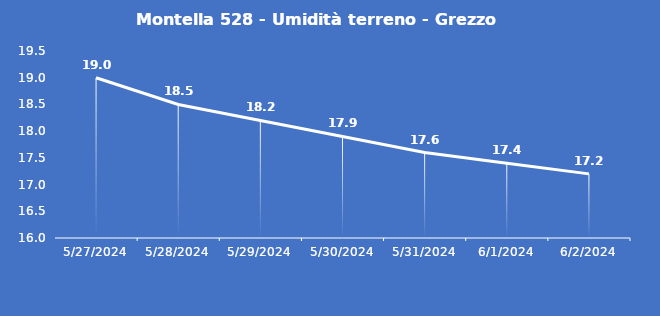
| Category | Montella 528 - Umidità terreno - Grezzo (%VWC) |
|---|---|
| 5/27/24 | 19 |
| 5/28/24 | 18.5 |
| 5/29/24 | 18.2 |
| 5/30/24 | 17.9 |
| 5/31/24 | 17.6 |
| 6/1/24 | 17.4 |
| 6/2/24 | 17.2 |